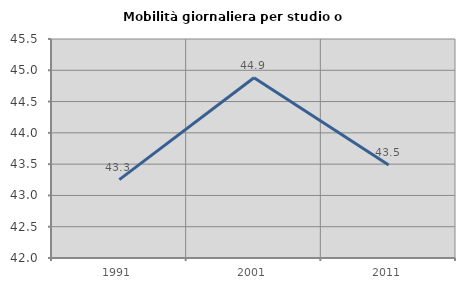
| Category | Mobilità giornaliera per studio o lavoro |
|---|---|
| 1991.0 | 43.253 |
| 2001.0 | 44.881 |
| 2011.0 | 43.487 |